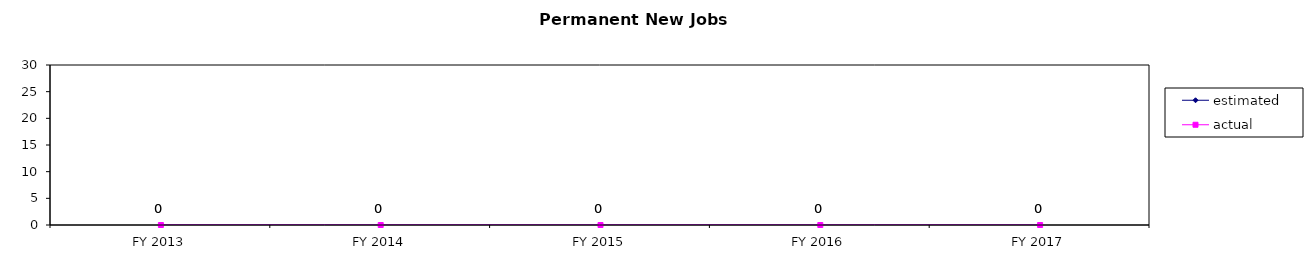
| Category | estimated | actual |
|---|---|---|
| FY 2013 | 0 | 0 |
| FY 2014 | 0 | 0 |
| FY 2015 | 0 | 0 |
| FY 2016 | 0 | 0 |
| FY 2017 | 0 | 0 |